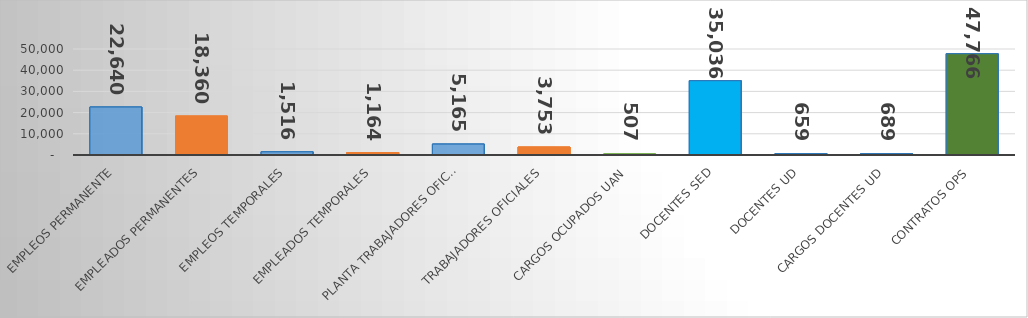
| Category | Series 0 |
|---|---|
| EMPLEOS PERMANENTE | 22640 |
| EMPLEADOS PERMANENTES | 18360 |
| EMPLEOS TEMPORALES | 1516 |
| EMPLEADOS TEMPORALES | 1164 |
| PLANTA TRABAJADORES OFICIALES | 5165 |
| TRABAJADORES OFICIALES | 3753 |
| CARGOS OCUPADOS UAN | 507 |
| DOCENTES SED | 35036 |
| DOCENTES UD | 659 |
| CARGOS DOCENTES UD | 689 |
| CONTRATOS OPS | 47766 |